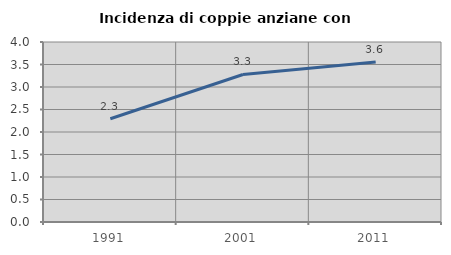
| Category | Incidenza di coppie anziane con figli |
|---|---|
| 1991.0 | 2.295 |
| 2001.0 | 3.278 |
| 2011.0 | 3.558 |